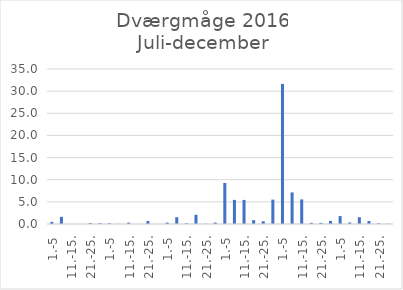
| Category | Series 0 |
|---|---|
| 1.-5 | 0.48 |
| 6.-10. | 1.619 |
| 11.-15. | 0 |
| 16.-20. | 0 |
| 21.-25. | 0.221 |
| 26.-31. | 0.188 |
| 1.-5 | 0.182 |
| 6.-10. | 0.037 |
| 11.-15. | 0.304 |
| 16.-20. | 0 |
| 21.-25. | 0.674 |
| 26.-31. | 0 |
| 1.-5 | 0.319 |
| 6.-10. | 1.533 |
| 11.-15. | 0.174 |
| 16.-20. | 2.073 |
| 21.-25. | 0.064 |
| 26.-30. | 0.323 |
| 1.-5 | 9.272 |
| 6.-10. | 5.445 |
| 11.-15. | 5.435 |
| 16.-20. | 0.867 |
| 21.-25. | 0.62 |
| 26.-31. | 5.503 |
| 1.-5 | 31.635 |
| 6.-10. | 7.132 |
| 11.-15. | 5.548 |
| 16.-20. | 0.264 |
| 21.-25. | 0.256 |
| 26.-30. | 0.701 |
| 1.-5 | 1.79 |
| 6.-10. | 0.333 |
| 11.-15. | 1.53 |
| 16.-20. | 0.685 |
| 21.-25. | 0.165 |
| 26.-31. | 0.059 |